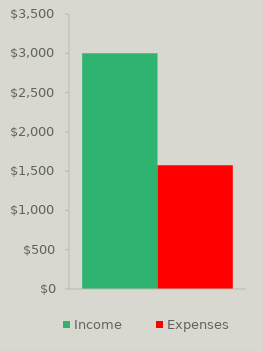
| Category | Income | Expenses |
|---|---|---|
| 0 | 3000 | 1576 |